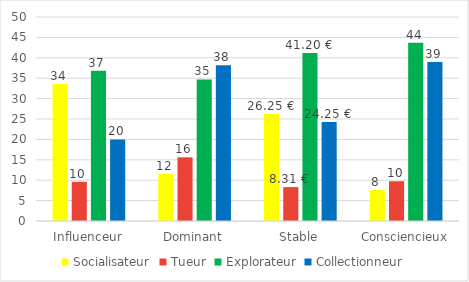
| Category | Socialisateur | Tueur | Explorateur | Collectionneur |
|---|---|---|---|---|
| Influenceur | 33.6 | 9.6 | 36.8 | 20 |
| Dominant | 11.561 | 15.607 | 34.682 | 38.15 |
| Stable | 26.246 | 8.306 | 41.196 | 24.252 |
| Consciencieux | 7.581 | 9.747 | 43.682 | 38.989 |